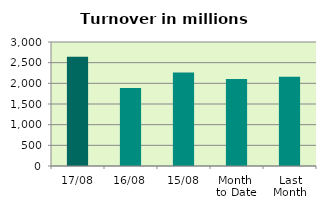
| Category | Series 0 |
|---|---|
| 17/08 | 2641.765 |
| 16/08 | 1887.901 |
| 15/08 | 2260.749 |
| Month 
to Date | 2107.661 |
| Last
Month | 2159.874 |